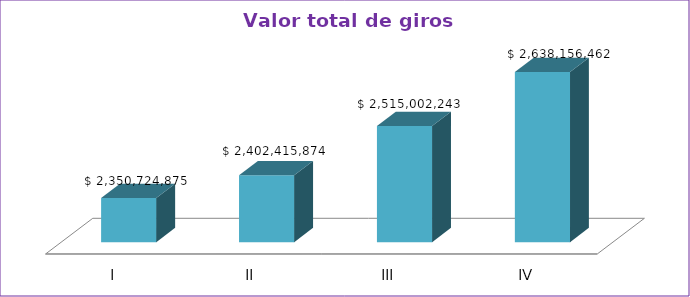
| Category | Series 0 |
|---|---|
| I | 2350724875 |
| II | 2402415874 |
| III | 2515002243 |
| IV | 2638156462 |